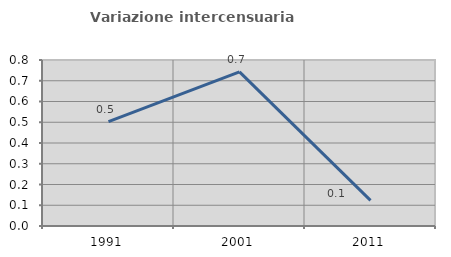
| Category | Variazione intercensuaria annua |
|---|---|
| 1991.0 | 0.503 |
| 2001.0 | 0.743 |
| 2011.0 | 0.124 |